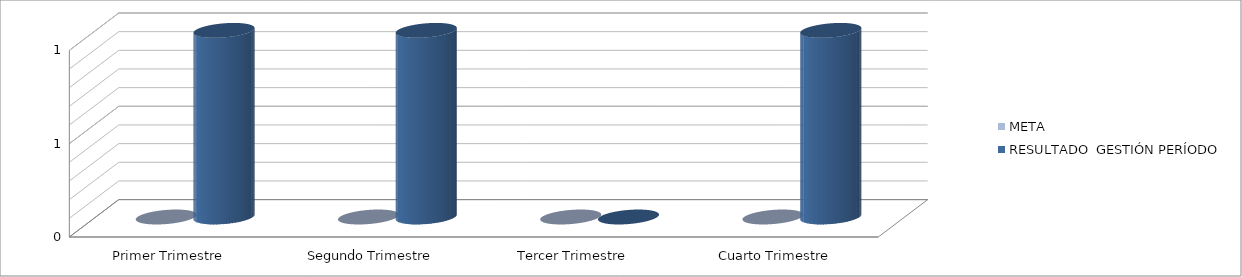
| Category | META | RESULTADO  GESTIÓN PERÍODO |
|---|---|---|
| Primer Trimestre | 0 | 1 |
| Segundo Trimestre | 0 | 1 |
| Tercer Trimestre | 0 | 0 |
| Cuarto Trimestre | 0 | 1 |